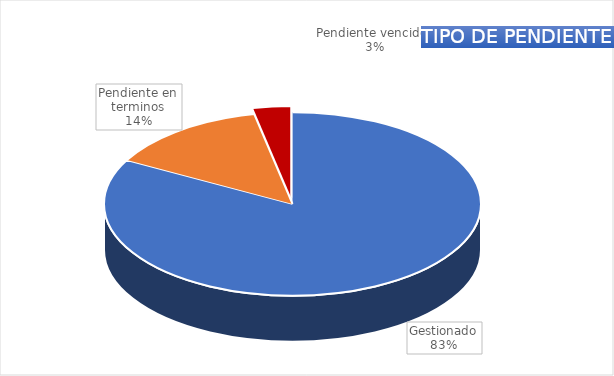
| Category | Total |
|---|---|
| Gestionado | 102 |
| Pendiente en terminos | 17 |
| Pendiente vencidos | 4 |